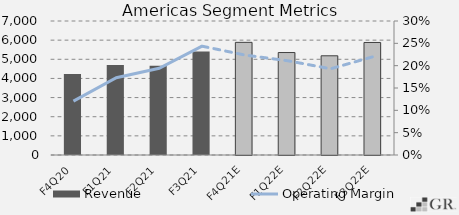
| Category | Revenue |
|---|---|
|  F4Q20  | 4232.9 |
|  F1Q21  | 4703.2 |
|  F2Q21  | 4664.6 |
|  F3Q21  | 5400.3 |
|  F4Q21E  | 5884.884 |
|  F1Q22E  | 5352.788 |
|  F2Q22E  | 5182.884 |
|  F3Q22E  | 5878.367 |